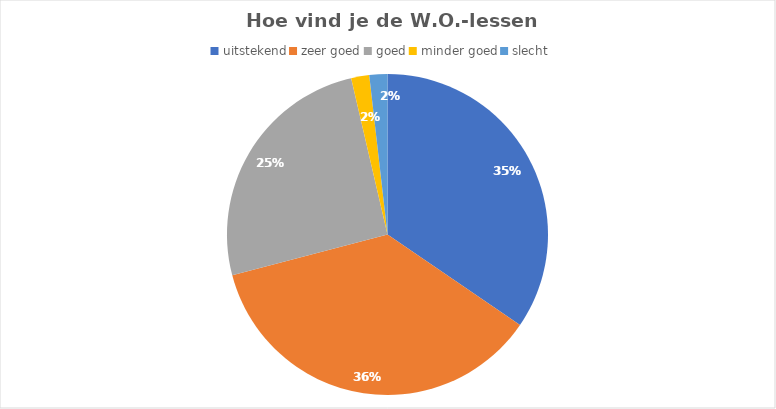
| Category | Series 0 |
|---|---|
| uitstekend | 19 |
| zeer goed | 20 |
| goed | 14 |
| minder goed | 1 |
| slecht | 1 |